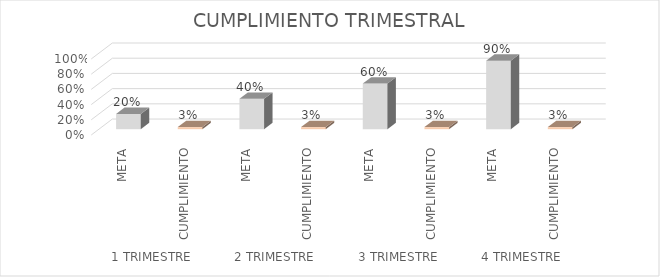
| Category | Series 0 |
|---|---|
| 0 | 0.2 |
| 1 | 0.027 |
| 2 | 0.4 |
| 3 | 0.027 |
| 4 | 0.6 |
| 5 | 0.027 |
| 6 | 0.9 |
| 7 | 0.027 |